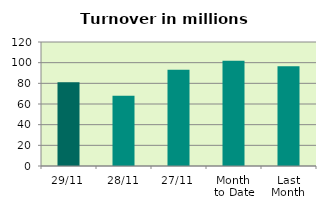
| Category | Series 0 |
|---|---|
| 29/11 | 81.163 |
| 28/11 | 67.905 |
| 27/11 | 93.176 |
| Month 
to Date | 101.866 |
| Last
Month | 96.433 |